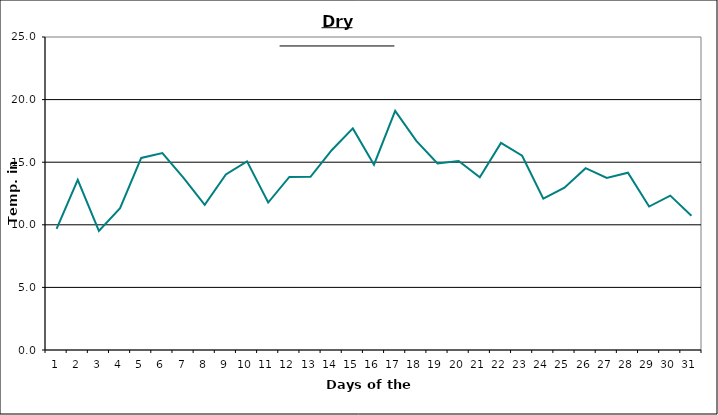
| Category | Series 0 |
|---|---|
| 0 | 9.68 |
| 1 | 13.59 |
| 2 | 9.52 |
| 3 | 11.33 |
| 4 | 15.34 |
| 5 | 15.73 |
| 6 | 13.75 |
| 7 | 11.6 |
| 8 | 14.02 |
| 9 | 15.07 |
| 10 | 11.78 |
| 11 | 13.82 |
| 12 | 13.83 |
| 13 | 15.96 |
| 14 | 17.7 |
| 15 | 14.8 |
| 16 | 19.1 |
| 17 | 16.7 |
| 18 | 14.9 |
| 19 | 15.1 |
| 20 | 13.8 |
| 21 | 16.54 |
| 22 | 15.52 |
| 23 | 12.09 |
| 24 | 12.97 |
| 25 | 14.52 |
| 26 | 13.74 |
| 27 | 14.16 |
| 28 | 11.46 |
| 29 | 12.33 |
| 30 | 10.73 |